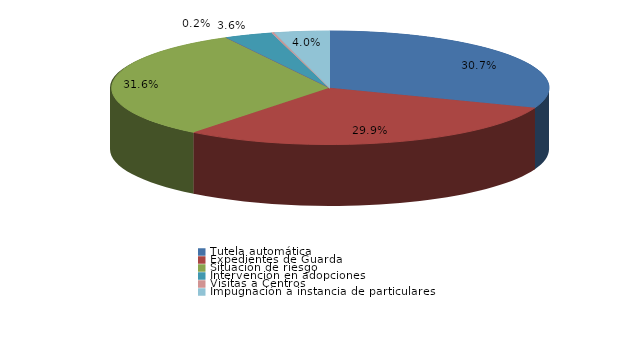
| Category | Series 0 |
|---|---|
| Tutela automática | 320 |
| Expedientes de Guarda | 311 |
| Situación de riesgo | 329 |
| Intervención en acogimientos | 0 |
| Intervención en adopciones | 37 |
| Defensa de los derechos fundamentales | 0 |
| Sustracción internacional de menores | 0 |
| Visitas a Centros | 2 |
| Ensayos Clínicos | 0 |
| Impugnación a instacia del Fiscal | 0 |
| Impugnación a instancia de particulares | 42 |